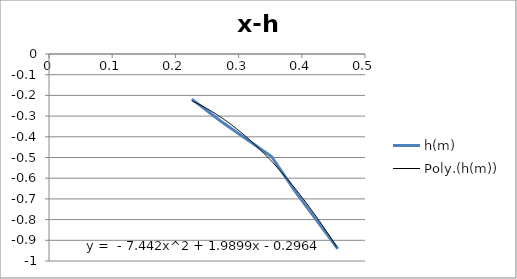
| Category | h(m) |
|---|---|
| 0.226 | -0.218 |
| 0.272 | -0.325 |
| 0.352 | -0.495 |
| 0.389 | -0.661 |
| 0.457 | -0.941 |